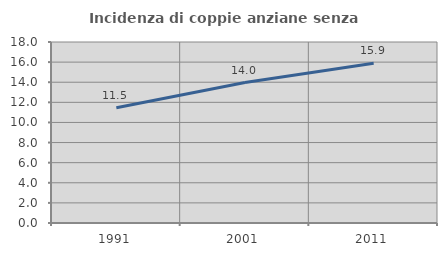
| Category | Incidenza di coppie anziane senza figli  |
|---|---|
| 1991.0 | 11.462 |
| 2001.0 | 13.964 |
| 2011.0 | 15.876 |